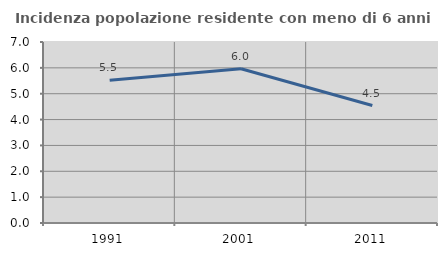
| Category | Incidenza popolazione residente con meno di 6 anni |
|---|---|
| 1991.0 | 5.525 |
| 2001.0 | 5.965 |
| 2011.0 | 4.542 |